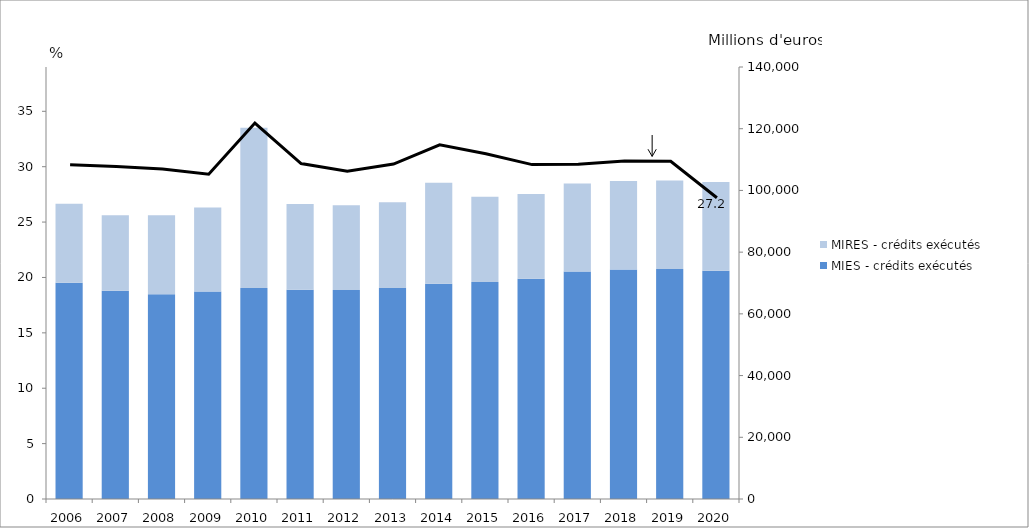
| Category | MIES - crédits exécutés  | MIRES - crédits exécutés |
|---|---|---|
| 2006.0 | 70040.859 | 25649.168 |
| 2007.0 | 67493.471 | 24499.528 |
| 2008.0 | 66376.695 | 25579.207 |
| 2009.0 | 67223.523 | 27251.85 |
| 2010.0 | 68339.625 | 51984.562 |
| 2011.0 | 67795.618 | 27840.777 |
| 2012.0 | 67723.294 | 27459.912 |
| 2013.0 | 68376.705 | 27804.501 |
| 2014.0 | 69779.717 | 32744.892 |
| 2015.0 | 70354.826 | 27556.971 |
| 2016.0 | 71394.526 | 27488.121 |
| 2017.0 | 73750.834 | 28525.229 |
| 2018.0 | 74409.677 | 28636.412 |
| 2019.0 | 74551.46 | 28670.035 |
| 2020.0 | 73968.618 | 28747.553 |